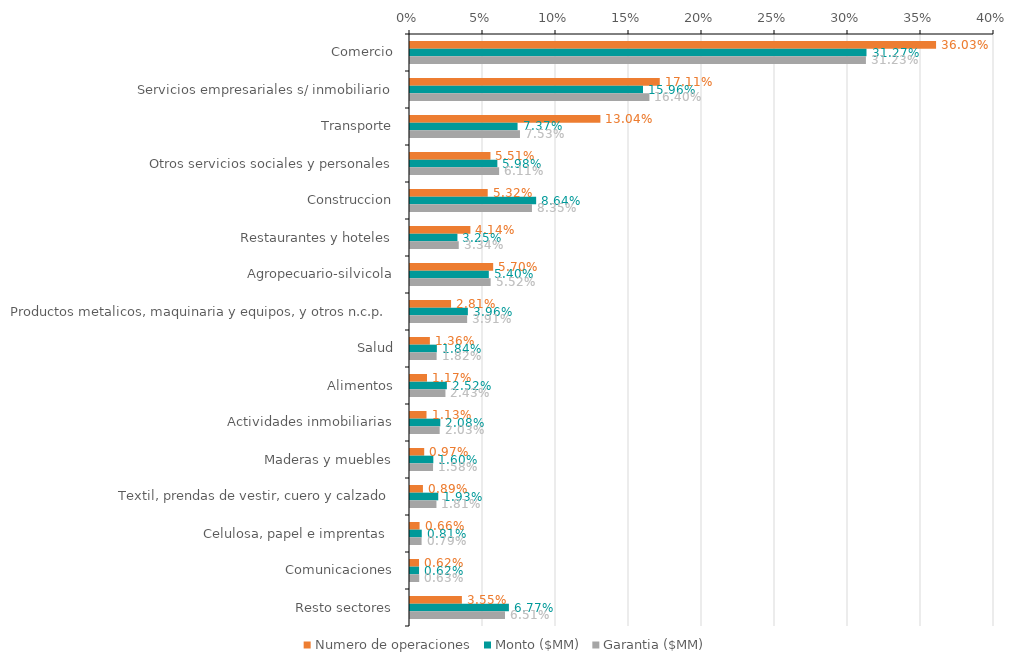
| Category | Numero de operaciones | Monto ($MM) | Garantia ($MM) |
|---|---|---|---|
| Comercio | 0.36 | 0.313 | 0.312 |
| Servicios empresariales s/ inmobiliario | 0.171 | 0.16 | 0.164 |
| Transporte | 0.13 | 0.074 | 0.075 |
| Otros servicios sociales y personales | 0.055 | 0.06 | 0.061 |
| Construccion | 0.053 | 0.086 | 0.084 |
| Restaurantes y hoteles | 0.041 | 0.032 | 0.033 |
| Agropecuario-silvicola | 0.057 | 0.054 | 0.055 |
| Productos metalicos, maquinaria y equipos, y otros n.c.p. | 0.028 | 0.04 | 0.039 |
| Salud | 0.014 | 0.018 | 0.018 |
| Alimentos | 0.012 | 0.025 | 0.024 |
| Actividades inmobiliarias | 0.011 | 0.021 | 0.02 |
| Maderas y muebles | 0.01 | 0.016 | 0.016 |
| Textil, prendas de vestir, cuero y calzado | 0.009 | 0.019 | 0.018 |
| Celulosa, papel e imprentas  | 0.007 | 0.008 | 0.008 |
| Comunicaciones | 0.006 | 0.006 | 0.006 |
| Resto sectores | 0.036 | 0.068 | 0.065 |